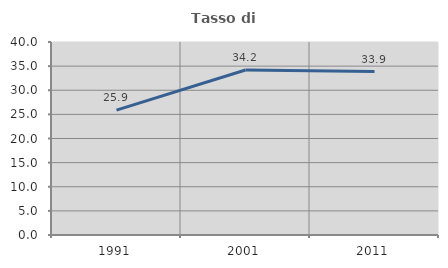
| Category | Tasso di occupazione   |
|---|---|
| 1991.0 | 25.891 |
| 2001.0 | 34.2 |
| 2011.0 | 33.884 |